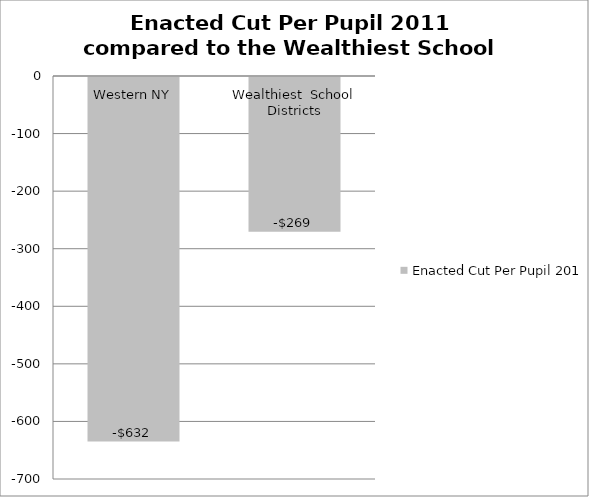
| Category | Enacted Cut Per Pupil 2011  |
|---|---|
| Western NY | -633.213 |
| Wealthiest  School Districts | -268.999 |